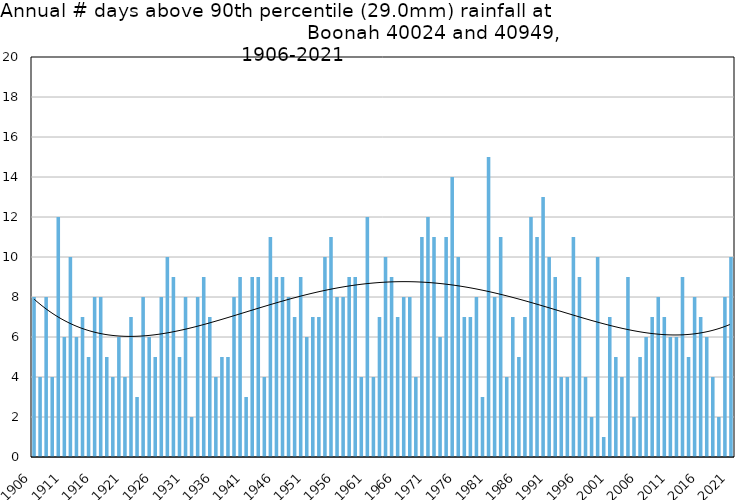
| Category | Annual # days above 90th percentile |
|---|---|
| 1906 | 8 |
| 1907 | 4 |
| 1908 | 8 |
| 1909 | 4 |
| 1910 | 12 |
| 1911 | 6 |
| 1912 | 10 |
| 1913 | 6 |
| 1914 | 7 |
| 1915 | 5 |
| 1916 | 8 |
| 1917 | 8 |
| 1918 | 5 |
| 1919 | 4 |
| 1920 | 6 |
| 1921 | 4 |
| 1922 | 7 |
| 1923 | 3 |
| 1924 | 8 |
| 1925 | 6 |
| 1926 | 5 |
| 1927 | 8 |
| 1928 | 10 |
| 1929 | 9 |
| 1930 | 5 |
| 1931 | 8 |
| 1932 | 2 |
| 1933 | 8 |
| 1934 | 9 |
| 1935 | 7 |
| 1936 | 4 |
| 1937 | 5 |
| 1938 | 5 |
| 1939 | 8 |
| 1940 | 9 |
| 1941 | 3 |
| 1942 | 9 |
| 1943 | 9 |
| 1944 | 4 |
| 1945 | 11 |
| 1946 | 9 |
| 1947 | 9 |
| 1948 | 8 |
| 1949 | 7 |
| 1950 | 9 |
| 1951 | 6 |
| 1952 | 7 |
| 1953 | 7 |
| 1954 | 10 |
| 1955 | 11 |
| 1956 | 8 |
| 1957 | 8 |
| 1958 | 9 |
| 1959 | 9 |
| 1960 | 4 |
| 1961 | 12 |
| 1962 | 4 |
| 1963 | 7 |
| 1964 | 10 |
| 1965 | 9 |
| 1966 | 7 |
| 1967 | 8 |
| 1968 | 8 |
| 1969 | 4 |
| 1970 | 11 |
| 1971 | 12 |
| 1972 | 11 |
| 1973 | 6 |
| 1974 | 11 |
| 1975 | 14 |
| 1976 | 10 |
| 1977 | 7 |
| 1978 | 7 |
| 1979 | 8 |
| 1980 | 3 |
| 1981 | 15 |
| 1982 | 8 |
| 1983 | 11 |
| 1984 | 4 |
| 1985 | 7 |
| 1986 | 5 |
| 1987 | 7 |
| 1988 | 12 |
| 1989 | 11 |
| 1990 | 13 |
| 1991 | 10 |
| 1992 | 9 |
| 1993 | 4 |
| 1994 | 4 |
| 1995 | 11 |
| 1996 | 9 |
| 1997 | 4 |
| 1998 | 2 |
| 1999 | 10 |
| 2000 | 1 |
| 2001 | 7 |
| 2002 | 5 |
| 2003 | 4 |
| 2004 | 9 |
| 2005 | 2 |
| 2006 | 5 |
| 2007 | 6 |
| 2008 | 7 |
| 2009 | 8 |
| 2010 | 7 |
| 2011 | 6 |
| 2012 | 6 |
| 2013 | 9 |
| 2014 | 5 |
| 2015 | 8 |
| 2016 | 7 |
| 2017 | 6 |
| 2018 | 4 |
| 2019 | 2 |
| 2020 | 8 |
| 2021 | 10 |